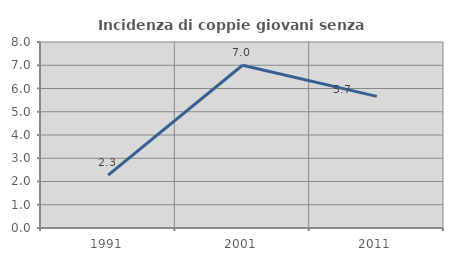
| Category | Incidenza di coppie giovani senza figli |
|---|---|
| 1991.0 | 2.273 |
| 2001.0 | 7 |
| 2011.0 | 5.66 |